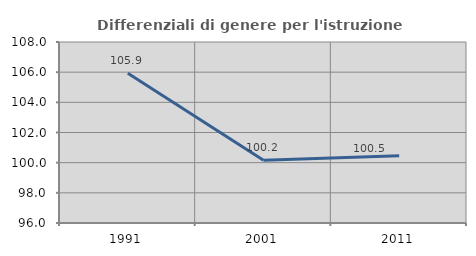
| Category | Differenziali di genere per l'istruzione superiore |
|---|---|
| 1991.0 | 105.922 |
| 2001.0 | 100.158 |
| 2011.0 | 100.456 |